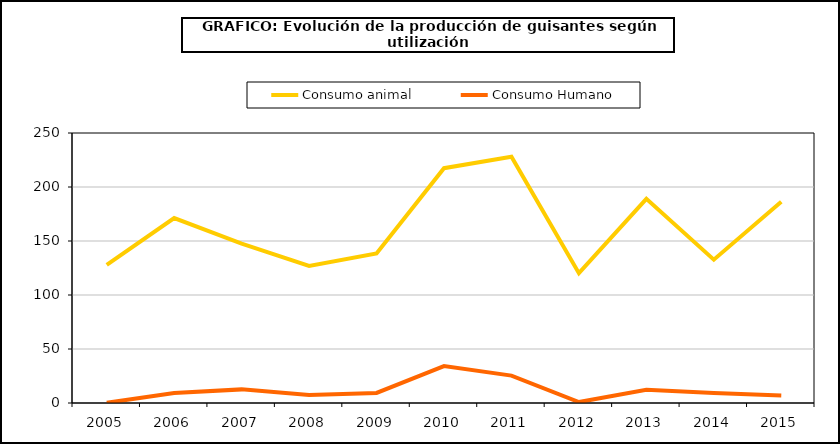
| Category | Consumo animal | Consumo Humano |
|---|---|---|
| 2005.0 | 127.913 | 0.178 |
| 2006.0 | 171.289 | 9.265 |
| 2007.0 | 147.595 | 12.612 |
| 2008.0 | 126.979 | 7.448 |
| 2009.0 | 138.522 | 9.348 |
| 2010.0 | 217.397 | 34.178 |
| 2011.0 | 228.032 | 25.395 |
| 2012.0 | 120.217 | 0.857 |
| 2013.0 | 189.031 | 12.295 |
| 2014.0 | 132.687 | 9.168 |
| 2015.0 | 186.379 | 7.01 |